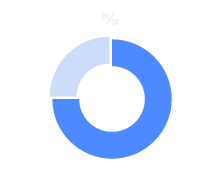
| Category | Series 0 |
|---|---|
| Complete | 0.25 |
| Remaining | 0.75 |